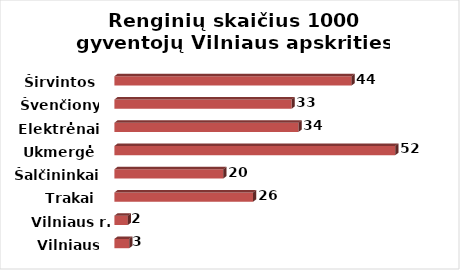
| Category | Series 0 |
|---|---|
| Vilniaus m. | 2.727 |
| Vilniaus r. | 2.48 |
| Trakai | 25.562 |
| Šalčininkai | 20.083 |
| Ukmergė | 51.767 |
| Elektrėnai | 33.931 |
| Švenčionys | 32.677 |
| Širvintos | 43.729 |